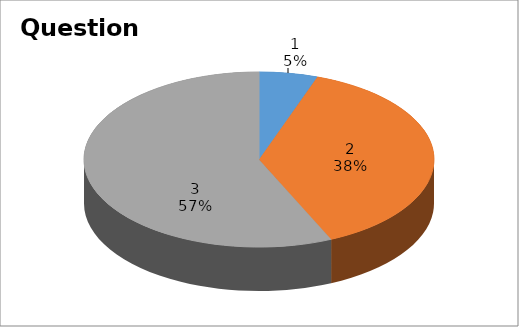
| Category | Series 0 |
|---|---|
| 0 | 2 |
| 1 | 14 |
| 2 | 21 |